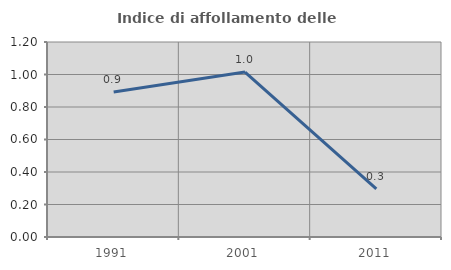
| Category | Indice di affollamento delle abitazioni  |
|---|---|
| 1991.0 | 0.893 |
| 2001.0 | 1.015 |
| 2011.0 | 0.297 |